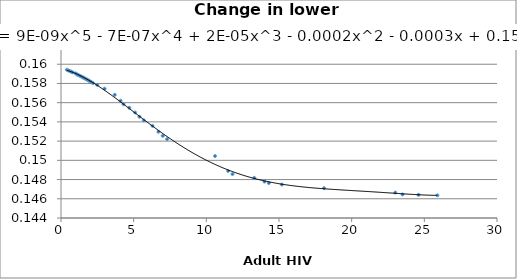
| Category | Series 0 |
|---|---|
| 0.4 | 0.159 |
| 0.5 | 0.159 |
| 0.6 | 0.159 |
| 0.7 | 0.159 |
| 0.8 | 0.159 |
| 1.0 | 0.159 |
| 1.1 | 0.159 |
| 1.2 | 0.159 |
| 1.3 | 0.159 |
| 1.4 | 0.159 |
| 1.5 | 0.159 |
| 1.6 | 0.159 |
| 1.7 | 0.158 |
| 1.8 | 0.158 |
| 1.9 | 0.158 |
| 2.0 | 0.158 |
| 2.1 | 0.158 |
| 2.2 | 0.158 |
| 2.5 | 0.158 |
| 3.0 | 0.157 |
| 3.7 | 0.157 |
| 4.1 | 0.156 |
| 4.3 | 0.156 |
| 4.7 | 0.155 |
| 5.1 | 0.155 |
| 5.4 | 0.155 |
| 5.7 | 0.154 |
| 6.3 | 0.154 |
| 6.7 | 0.153 |
| 7.0 | 0.153 |
| 7.3 | 0.152 |
| 10.6 | 0.15 |
| 11.5 | 0.149 |
| 11.8 | 0.149 |
| 13.3 | 0.148 |
| 14.0 | 0.148 |
| 14.3 | 0.148 |
| 15.2 | 0.147 |
| 18.1 | 0.147 |
| 23.0 | 0.147 |
| 23.5 | 0.146 |
| 24.6 | 0.146 |
| 25.9 | 0.146 |